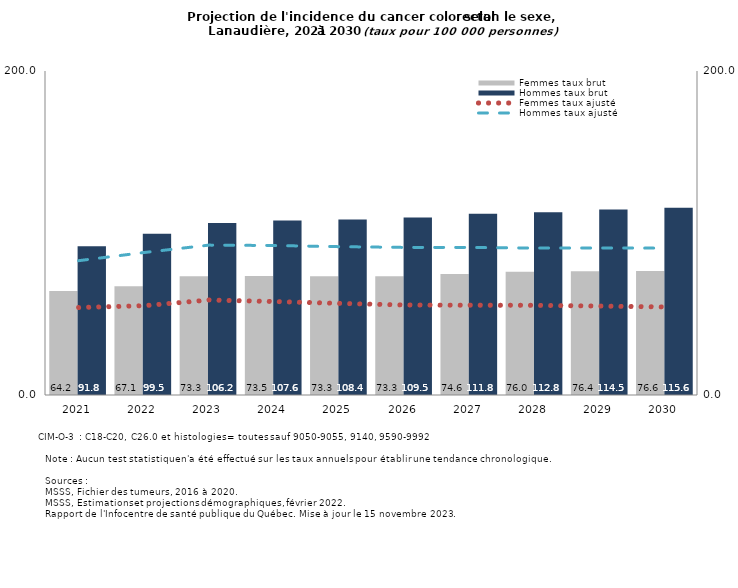
| Category | Femmes taux brut | Hommes taux brut |
|---|---|---|
| 2021.0 | 64.155 | 91.767 |
| 2022.0 | 67.143 | 99.515 |
| 2023.0 | 73.312 | 106.226 |
| 2024.0 | 73.485 | 107.65 |
| 2025.0 | 73.267 | 108.358 |
| 2026.0 | 73.251 | 109.509 |
| 2027.0 | 74.62 | 111.83 |
| 2028.0 | 76.034 | 112.842 |
| 2029.0 | 76.416 | 114.456 |
| 2030.0 | 76.56 | 115.582 |